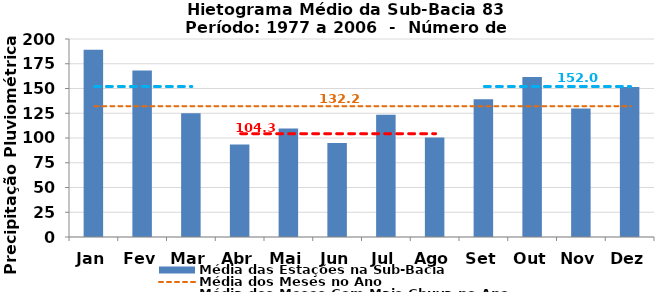
| Category | Média das Estações na Sub-Bacia |
|---|---|
| Jan | 189.156 |
| Fev | 168.107 |
| Mar | 125.025 |
| Abr | 93.321 |
| Mai | 109.478 |
| Jun | 94.827 |
| Jul | 123.487 |
| Ago | 100.606 |
| Set | 139.138 |
| Out | 161.501 |
| Nov | 129.772 |
| Dez | 151.628 |